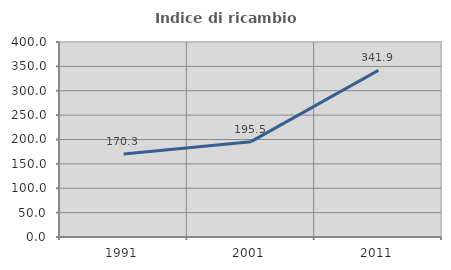
| Category | Indice di ricambio occupazionale  |
|---|---|
| 1991.0 | 170.33 |
| 2001.0 | 195.536 |
| 2011.0 | 341.909 |